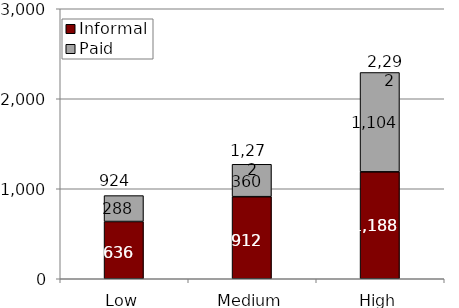
| Category | Informal  | Paid |
|---|---|---|
| Low | 636 | 288 |
| Medium | 912 | 360 |
| High | 1188 | 1104 |